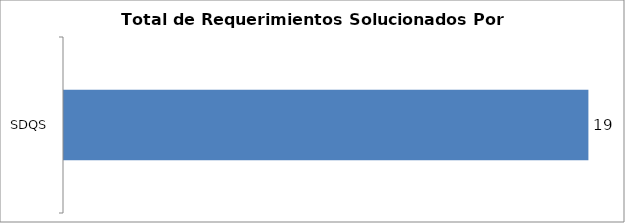
| Category | Total |
|---|---|
| SDQS | 19 |